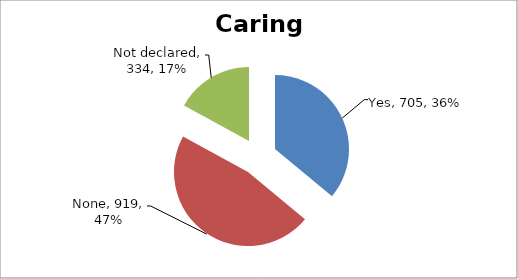
| Category | Series 0 |
|---|---|
| Yes | 705 |
| None | 919 |
| Not declared | 334 |